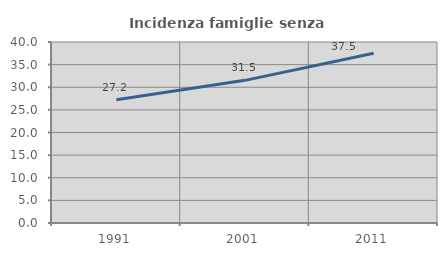
| Category | Incidenza famiglie senza nuclei |
|---|---|
| 1991.0 | 27.219 |
| 2001.0 | 31.525 |
| 2011.0 | 37.529 |